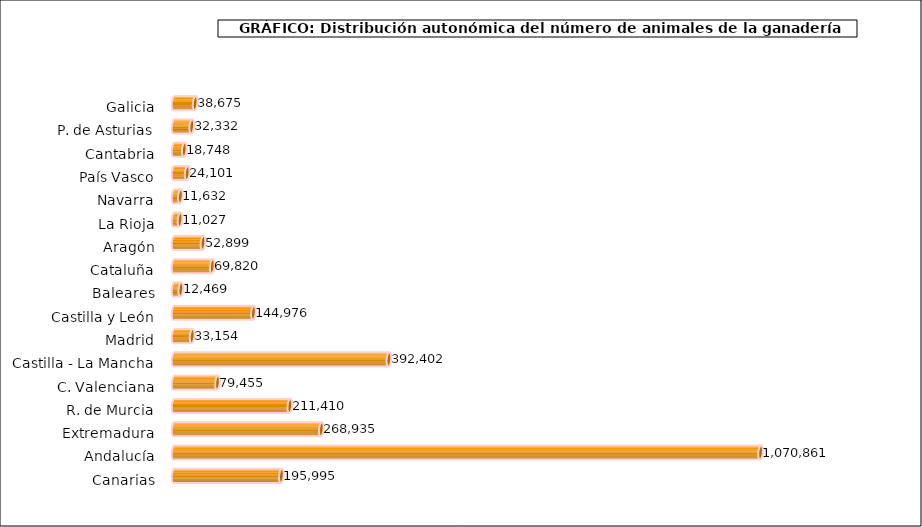
| Category | num. Animales |
|---|---|
|   Galicia | 38675 |
|   P. de Asturias | 32332 |
|   Cantabria | 18748 |
|   País Vasco | 24101 |
|   Navarra | 11632 |
|   La Rioja | 11027 |
|   Aragón | 52899 |
|   Cataluña | 69820 |
|   Baleares | 12469 |
|   Castilla y León | 144976 |
|   Madrid | 33154 |
|   Castilla - La Mancha | 392402 |
|   C. Valenciana | 79455 |
|   R. de Murcia | 211410 |
|   Extremadura | 268935 |
|   Andalucía | 1070861 |
|   Canarias | 195995 |